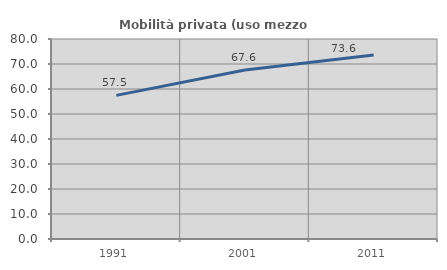
| Category | Mobilità privata (uso mezzo privato) |
|---|---|
| 1991.0 | 57.456 |
| 2001.0 | 67.58 |
| 2011.0 | 73.588 |